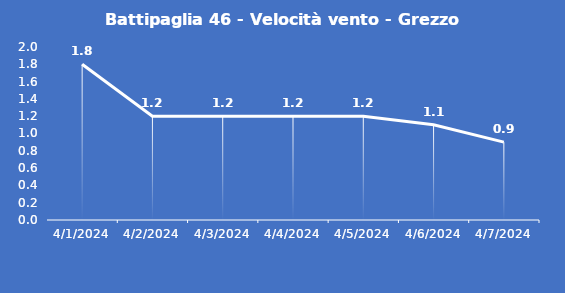
| Category | Battipaglia 46 - Velocità vento - Grezzo (m/s) |
|---|---|
| 4/1/24 | 1.8 |
| 4/2/24 | 1.2 |
| 4/3/24 | 1.2 |
| 4/4/24 | 1.2 |
| 4/5/24 | 1.2 |
| 4/6/24 | 1.1 |
| 4/7/24 | 0.9 |